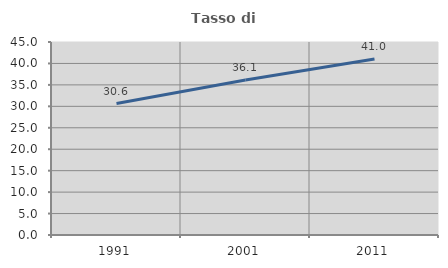
| Category | Tasso di occupazione   |
|---|---|
| 1991.0 | 30.648 |
| 2001.0 | 36.133 |
| 2011.0 | 41.034 |